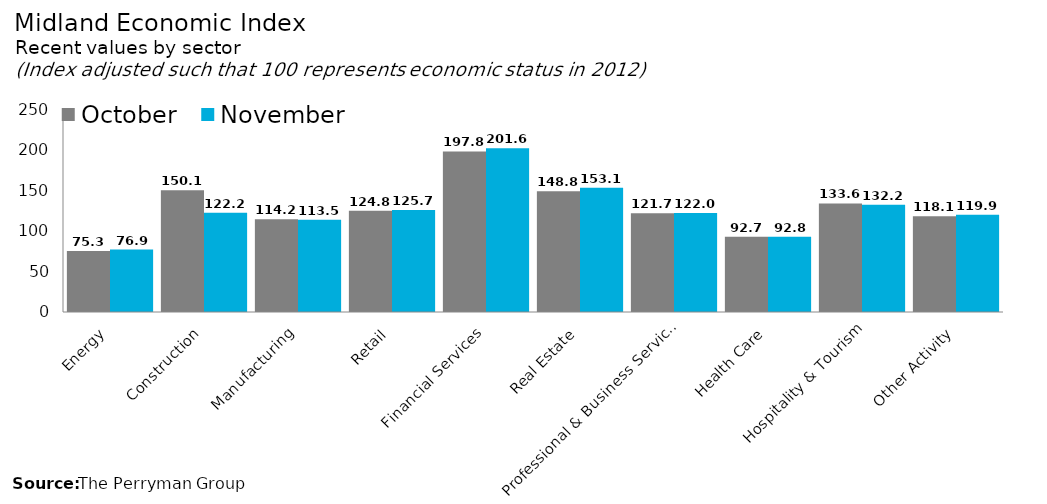
| Category | October | November |
|---|---|---|
| Energy | 75.269 | 76.858 |
| Construction | 150.059 | 122.199 |
| Manufacturing | 114.239 | 113.486 |
| Retail | 124.814 | 125.698 |
| Financial Services | 197.811 | 201.64 |
| Real Estate | 148.837 | 153.114 |
| Professional & Business Services | 121.736 | 121.986 |
| Health Care | 92.749 | 92.79 |
| Hospitality & Tourism | 133.641 | 132.204 |
| Other Activity | 118.071 | 119.861 |